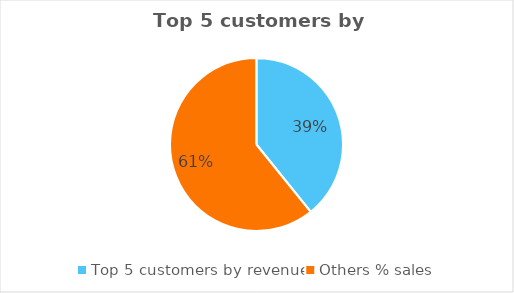
| Category | Series 0 |
|---|---|
| Top 5 customers by revenue | 0.392 |
| Others % sales | 0.608 |